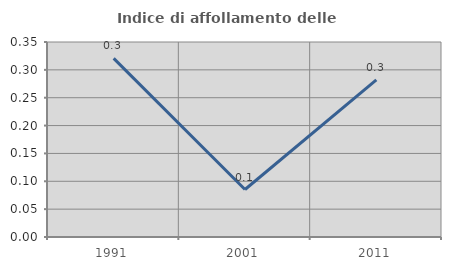
| Category | Indice di affollamento delle abitazioni  |
|---|---|
| 1991.0 | 0.321 |
| 2001.0 | 0.085 |
| 2011.0 | 0.282 |